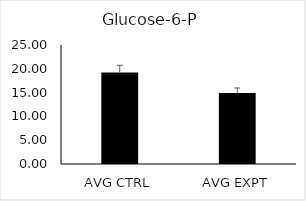
| Category | Series 0 |
|---|---|
| AVG CTRL | 19.224 |
| AVG EXPT | 14.938 |